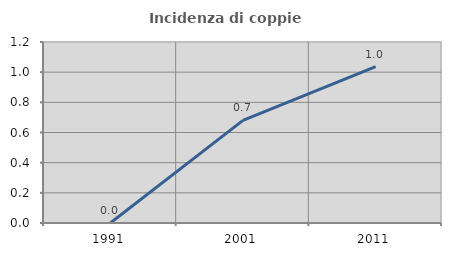
| Category | Incidenza di coppie miste |
|---|---|
| 1991.0 | 0 |
| 2001.0 | 0.68 |
| 2011.0 | 1.036 |